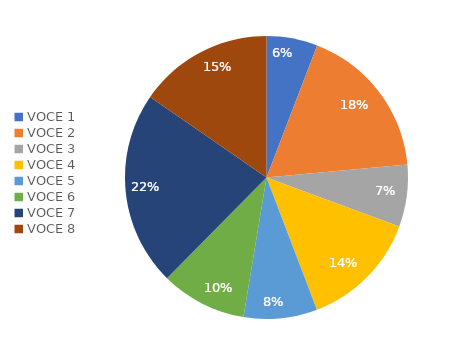
| Category | Series 0 | Series 1 |
|---|---|---|
| VOCE 1 | 0.058 | 0.058 |
| VOCE 2 | 0.177 | 0.177 |
| VOCE 3 | 0.071 | 0.071 |
| VOCE 4 | 0.136 | 0.136 |
| VOCE 5 | 0.084 | 0.084 |
| VOCE 6 | 0.098 | 0.098 |
| VOCE 7 | 0.222 | 0.222 |
| VOCE 8 | 0.154 | 0.154 |